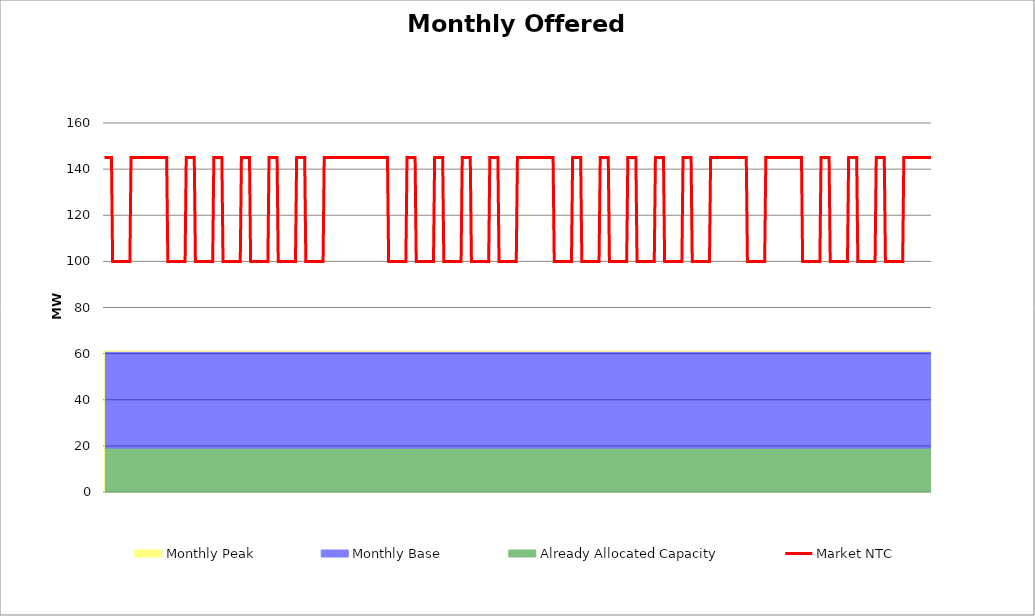
| Category | Market NTC |
|---|---|
| 0 | 145 |
| 1 | 145 |
| 2 | 145 |
| 3 | 145 |
| 4 | 145 |
| 5 | 145 |
| 6 | 145 |
| 7 | 100 |
| 8 | 100 |
| 9 | 100 |
| 10 | 100 |
| 11 | 100 |
| 12 | 100 |
| 13 | 100 |
| 14 | 100 |
| 15 | 100 |
| 16 | 100 |
| 17 | 100 |
| 18 | 100 |
| 19 | 100 |
| 20 | 100 |
| 21 | 100 |
| 22 | 100 |
| 23 | 145 |
| 24 | 145 |
| 25 | 145 |
| 26 | 145 |
| 27 | 145 |
| 28 | 145 |
| 29 | 145 |
| 30 | 145 |
| 31 | 145 |
| 32 | 145 |
| 33 | 145 |
| 34 | 145 |
| 35 | 145 |
| 36 | 145 |
| 37 | 145 |
| 38 | 145 |
| 39 | 145 |
| 40 | 145 |
| 41 | 145 |
| 42 | 145 |
| 43 | 145 |
| 44 | 145 |
| 45 | 145 |
| 46 | 145 |
| 47 | 145 |
| 48 | 145 |
| 49 | 145 |
| 50 | 145 |
| 51 | 145 |
| 52 | 145 |
| 53 | 145 |
| 54 | 145 |
| 55 | 100 |
| 56 | 100 |
| 57 | 100 |
| 58 | 100 |
| 59 | 100 |
| 60 | 100 |
| 61 | 100 |
| 62 | 100 |
| 63 | 100 |
| 64 | 100 |
| 65 | 100 |
| 66 | 100 |
| 67 | 100 |
| 68 | 100 |
| 69 | 100 |
| 70 | 100 |
| 71 | 145 |
| 72 | 145 |
| 73 | 145 |
| 74 | 145 |
| 75 | 145 |
| 76 | 145 |
| 77 | 145 |
| 78 | 145 |
| 79 | 100 |
| 80 | 100 |
| 81 | 100 |
| 82 | 100 |
| 83 | 100 |
| 84 | 100 |
| 85 | 100 |
| 86 | 100 |
| 87 | 100 |
| 88 | 100 |
| 89 | 100 |
| 90 | 100 |
| 91 | 100 |
| 92 | 100 |
| 93 | 100 |
| 94 | 100 |
| 95 | 145 |
| 96 | 145 |
| 97 | 145 |
| 98 | 145 |
| 99 | 145 |
| 100 | 145 |
| 101 | 145 |
| 102 | 145 |
| 103 | 100 |
| 104 | 100 |
| 105 | 100 |
| 106 | 100 |
| 107 | 100 |
| 108 | 100 |
| 109 | 100 |
| 110 | 100 |
| 111 | 100 |
| 112 | 100 |
| 113 | 100 |
| 114 | 100 |
| 115 | 100 |
| 116 | 100 |
| 117 | 100 |
| 118 | 100 |
| 119 | 145 |
| 120 | 145 |
| 121 | 145 |
| 122 | 145 |
| 123 | 145 |
| 124 | 145 |
| 125 | 145 |
| 126 | 145 |
| 127 | 100 |
| 128 | 100 |
| 129 | 100 |
| 130 | 100 |
| 131 | 100 |
| 132 | 100 |
| 133 | 100 |
| 134 | 100 |
| 135 | 100 |
| 136 | 100 |
| 137 | 100 |
| 138 | 100 |
| 139 | 100 |
| 140 | 100 |
| 141 | 100 |
| 142 | 100 |
| 143 | 145 |
| 144 | 145 |
| 145 | 145 |
| 146 | 145 |
| 147 | 145 |
| 148 | 145 |
| 149 | 145 |
| 150 | 145 |
| 151 | 100 |
| 152 | 100 |
| 153 | 100 |
| 154 | 100 |
| 155 | 100 |
| 156 | 100 |
| 157 | 100 |
| 158 | 100 |
| 159 | 100 |
| 160 | 100 |
| 161 | 100 |
| 162 | 100 |
| 163 | 100 |
| 164 | 100 |
| 165 | 100 |
| 166 | 100 |
| 167 | 145 |
| 168 | 145 |
| 169 | 145 |
| 170 | 145 |
| 171 | 145 |
| 172 | 145 |
| 173 | 145 |
| 174 | 145 |
| 175 | 100 |
| 176 | 100 |
| 177 | 100 |
| 178 | 100 |
| 179 | 100 |
| 180 | 100 |
| 181 | 100 |
| 182 | 100 |
| 183 | 100 |
| 184 | 100 |
| 185 | 100 |
| 186 | 100 |
| 187 | 100 |
| 188 | 100 |
| 189 | 100 |
| 190 | 100 |
| 191 | 145 |
| 192 | 145 |
| 193 | 145 |
| 194 | 145 |
| 195 | 145 |
| 196 | 145 |
| 197 | 145 |
| 198 | 145 |
| 199 | 145 |
| 200 | 145 |
| 201 | 145 |
| 202 | 145 |
| 203 | 145 |
| 204 | 145 |
| 205 | 145 |
| 206 | 145 |
| 207 | 145 |
| 208 | 145 |
| 209 | 145 |
| 210 | 145 |
| 211 | 145 |
| 212 | 145 |
| 213 | 145 |
| 214 | 145 |
| 215 | 145 |
| 216 | 145 |
| 217 | 145 |
| 218 | 145 |
| 219 | 145 |
| 220 | 145 |
| 221 | 145 |
| 222 | 145 |
| 223 | 145 |
| 224 | 145 |
| 225 | 145 |
| 226 | 145 |
| 227 | 145 |
| 228 | 145 |
| 229 | 145 |
| 230 | 145 |
| 231 | 145 |
| 232 | 145 |
| 233 | 145 |
| 234 | 145 |
| 235 | 145 |
| 236 | 145 |
| 237 | 145 |
| 238 | 145 |
| 239 | 145 |
| 240 | 145 |
| 241 | 145 |
| 242 | 145 |
| 243 | 145 |
| 244 | 145 |
| 245 | 145 |
| 246 | 145 |
| 247 | 100 |
| 248 | 100 |
| 249 | 100 |
| 250 | 100 |
| 251 | 100 |
| 252 | 100 |
| 253 | 100 |
| 254 | 100 |
| 255 | 100 |
| 256 | 100 |
| 257 | 100 |
| 258 | 100 |
| 259 | 100 |
| 260 | 100 |
| 261 | 100 |
| 262 | 100 |
| 263 | 145 |
| 264 | 145 |
| 265 | 145 |
| 266 | 145 |
| 267 | 145 |
| 268 | 145 |
| 269 | 145 |
| 270 | 145 |
| 271 | 100 |
| 272 | 100 |
| 273 | 100 |
| 274 | 100 |
| 275 | 100 |
| 276 | 100 |
| 277 | 100 |
| 278 | 100 |
| 279 | 100 |
| 280 | 100 |
| 281 | 100 |
| 282 | 100 |
| 283 | 100 |
| 284 | 100 |
| 285 | 100 |
| 286 | 100 |
| 287 | 145 |
| 288 | 145 |
| 289 | 145 |
| 290 | 145 |
| 291 | 145 |
| 292 | 145 |
| 293 | 145 |
| 294 | 145 |
| 295 | 100 |
| 296 | 100 |
| 297 | 100 |
| 298 | 100 |
| 299 | 100 |
| 300 | 100 |
| 301 | 100 |
| 302 | 100 |
| 303 | 100 |
| 304 | 100 |
| 305 | 100 |
| 306 | 100 |
| 307 | 100 |
| 308 | 100 |
| 309 | 100 |
| 310 | 100 |
| 311 | 145 |
| 312 | 145 |
| 313 | 145 |
| 314 | 145 |
| 315 | 145 |
| 316 | 145 |
| 317 | 145 |
| 318 | 145 |
| 319 | 100 |
| 320 | 100 |
| 321 | 100 |
| 322 | 100 |
| 323 | 100 |
| 324 | 100 |
| 325 | 100 |
| 326 | 100 |
| 327 | 100 |
| 328 | 100 |
| 329 | 100 |
| 330 | 100 |
| 331 | 100 |
| 332 | 100 |
| 333 | 100 |
| 334 | 100 |
| 335 | 145 |
| 336 | 145 |
| 337 | 145 |
| 338 | 145 |
| 339 | 145 |
| 340 | 145 |
| 341 | 145 |
| 342 | 145 |
| 343 | 100 |
| 344 | 100 |
| 345 | 100 |
| 346 | 100 |
| 347 | 100 |
| 348 | 100 |
| 349 | 100 |
| 350 | 100 |
| 351 | 100 |
| 352 | 100 |
| 353 | 100 |
| 354 | 100 |
| 355 | 100 |
| 356 | 100 |
| 357 | 100 |
| 358 | 100 |
| 359 | 145 |
| 360 | 145 |
| 361 | 145 |
| 362 | 145 |
| 363 | 145 |
| 364 | 145 |
| 365 | 145 |
| 366 | 145 |
| 367 | 145 |
| 368 | 145 |
| 369 | 145 |
| 370 | 145 |
| 371 | 145 |
| 372 | 145 |
| 373 | 145 |
| 374 | 145 |
| 375 | 145 |
| 376 | 145 |
| 377 | 145 |
| 378 | 145 |
| 379 | 145 |
| 380 | 145 |
| 381 | 145 |
| 382 | 145 |
| 383 | 145 |
| 384 | 145 |
| 385 | 145 |
| 386 | 145 |
| 387 | 145 |
| 388 | 145 |
| 389 | 145 |
| 390 | 145 |
| 391 | 100 |
| 392 | 100 |
| 393 | 100 |
| 394 | 100 |
| 395 | 100 |
| 396 | 100 |
| 397 | 100 |
| 398 | 100 |
| 399 | 100 |
| 400 | 100 |
| 401 | 100 |
| 402 | 100 |
| 403 | 100 |
| 404 | 100 |
| 405 | 100 |
| 406 | 100 |
| 407 | 145 |
| 408 | 145 |
| 409 | 145 |
| 410 | 145 |
| 411 | 145 |
| 412 | 145 |
| 413 | 145 |
| 414 | 145 |
| 415 | 100 |
| 416 | 100 |
| 417 | 100 |
| 418 | 100 |
| 419 | 100 |
| 420 | 100 |
| 421 | 100 |
| 422 | 100 |
| 423 | 100 |
| 424 | 100 |
| 425 | 100 |
| 426 | 100 |
| 427 | 100 |
| 428 | 100 |
| 429 | 100 |
| 430 | 100 |
| 431 | 145 |
| 432 | 145 |
| 433 | 145 |
| 434 | 145 |
| 435 | 145 |
| 436 | 145 |
| 437 | 145 |
| 438 | 145 |
| 439 | 100 |
| 440 | 100 |
| 441 | 100 |
| 442 | 100 |
| 443 | 100 |
| 444 | 100 |
| 445 | 100 |
| 446 | 100 |
| 447 | 100 |
| 448 | 100 |
| 449 | 100 |
| 450 | 100 |
| 451 | 100 |
| 452 | 100 |
| 453 | 100 |
| 454 | 100 |
| 455 | 145 |
| 456 | 145 |
| 457 | 145 |
| 458 | 145 |
| 459 | 145 |
| 460 | 145 |
| 461 | 145 |
| 462 | 145 |
| 463 | 100 |
| 464 | 100 |
| 465 | 100 |
| 466 | 100 |
| 467 | 100 |
| 468 | 100 |
| 469 | 100 |
| 470 | 100 |
| 471 | 100 |
| 472 | 100 |
| 473 | 100 |
| 474 | 100 |
| 475 | 100 |
| 476 | 100 |
| 477 | 100 |
| 478 | 100 |
| 479 | 145 |
| 480 | 145 |
| 481 | 145 |
| 482 | 145 |
| 483 | 145 |
| 484 | 145 |
| 485 | 145 |
| 486 | 145 |
| 487 | 100 |
| 488 | 100 |
| 489 | 100 |
| 490 | 100 |
| 491 | 100 |
| 492 | 100 |
| 493 | 100 |
| 494 | 100 |
| 495 | 100 |
| 496 | 100 |
| 497 | 100 |
| 498 | 100 |
| 499 | 100 |
| 500 | 100 |
| 501 | 100 |
| 502 | 100 |
| 503 | 145 |
| 504 | 145 |
| 505 | 145 |
| 506 | 145 |
| 507 | 145 |
| 508 | 145 |
| 509 | 145 |
| 510 | 145 |
| 511 | 100 |
| 512 | 100 |
| 513 | 100 |
| 514 | 100 |
| 515 | 100 |
| 516 | 100 |
| 517 | 100 |
| 518 | 100 |
| 519 | 100 |
| 520 | 100 |
| 521 | 100 |
| 522 | 100 |
| 523 | 100 |
| 524 | 100 |
| 525 | 100 |
| 526 | 100 |
| 527 | 145 |
| 528 | 145 |
| 529 | 145 |
| 530 | 145 |
| 531 | 145 |
| 532 | 145 |
| 533 | 145 |
| 534 | 145 |
| 535 | 145 |
| 536 | 145 |
| 537 | 145 |
| 538 | 145 |
| 539 | 145 |
| 540 | 145 |
| 541 | 145 |
| 542 | 145 |
| 543 | 145 |
| 544 | 145 |
| 545 | 145 |
| 546 | 145 |
| 547 | 145 |
| 548 | 145 |
| 549 | 145 |
| 550 | 145 |
| 551 | 145 |
| 552 | 145 |
| 553 | 145 |
| 554 | 145 |
| 555 | 145 |
| 556 | 145 |
| 557 | 145 |
| 558 | 145 |
| 559 | 100 |
| 560 | 100 |
| 561 | 100 |
| 562 | 100 |
| 563 | 100 |
| 564 | 100 |
| 565 | 100 |
| 566 | 100 |
| 567 | 100 |
| 568 | 100 |
| 569 | 100 |
| 570 | 100 |
| 571 | 100 |
| 572 | 100 |
| 573 | 100 |
| 574 | 100 |
| 575 | 145 |
| 576 | 145 |
| 577 | 145 |
| 578 | 145 |
| 579 | 145 |
| 580 | 145 |
| 581 | 145 |
| 582 | 145 |
| 583 | 145 |
| 584 | 145 |
| 585 | 145 |
| 586 | 145 |
| 587 | 145 |
| 588 | 145 |
| 589 | 145 |
| 590 | 145 |
| 591 | 145 |
| 592 | 145 |
| 593 | 145 |
| 594 | 145 |
| 595 | 145 |
| 596 | 145 |
| 597 | 145 |
| 598 | 145 |
| 599 | 145 |
| 600 | 145 |
| 601 | 145 |
| 602 | 145 |
| 603 | 145 |
| 604 | 145 |
| 605 | 145 |
| 606 | 145 |
| 607 | 100 |
| 608 | 100 |
| 609 | 100 |
| 610 | 100 |
| 611 | 100 |
| 612 | 100 |
| 613 | 100 |
| 614 | 100 |
| 615 | 100 |
| 616 | 100 |
| 617 | 100 |
| 618 | 100 |
| 619 | 100 |
| 620 | 100 |
| 621 | 100 |
| 622 | 100 |
| 623 | 145 |
| 624 | 145 |
| 625 | 145 |
| 626 | 145 |
| 627 | 145 |
| 628 | 145 |
| 629 | 145 |
| 630 | 145 |
| 631 | 100 |
| 632 | 100 |
| 633 | 100 |
| 634 | 100 |
| 635 | 100 |
| 636 | 100 |
| 637 | 100 |
| 638 | 100 |
| 639 | 100 |
| 640 | 100 |
| 641 | 100 |
| 642 | 100 |
| 643 | 100 |
| 644 | 100 |
| 645 | 100 |
| 646 | 100 |
| 647 | 145 |
| 648 | 145 |
| 649 | 145 |
| 650 | 145 |
| 651 | 145 |
| 652 | 145 |
| 653 | 145 |
| 654 | 145 |
| 655 | 100 |
| 656 | 100 |
| 657 | 100 |
| 658 | 100 |
| 659 | 100 |
| 660 | 100 |
| 661 | 100 |
| 662 | 100 |
| 663 | 100 |
| 664 | 100 |
| 665 | 100 |
| 666 | 100 |
| 667 | 100 |
| 668 | 100 |
| 669 | 100 |
| 670 | 100 |
| 671 | 145 |
| 672 | 145 |
| 673 | 145 |
| 674 | 145 |
| 675 | 145 |
| 676 | 145 |
| 677 | 145 |
| 678 | 145 |
| 679 | 100 |
| 680 | 100 |
| 681 | 100 |
| 682 | 100 |
| 683 | 100 |
| 684 | 100 |
| 685 | 100 |
| 686 | 100 |
| 687 | 100 |
| 688 | 100 |
| 689 | 100 |
| 690 | 100 |
| 691 | 100 |
| 692 | 100 |
| 693 | 100 |
| 694 | 100 |
| 695 | 145 |
| 696 | 145 |
| 697 | 145 |
| 698 | 145 |
| 699 | 145 |
| 700 | 145 |
| 701 | 145 |
| 702 | 145 |
| 703 | 145 |
| 704 | 145 |
| 705 | 145 |
| 706 | 145 |
| 707 | 145 |
| 708 | 145 |
| 709 | 145 |
| 710 | 145 |
| 711 | 145 |
| 712 | 145 |
| 713 | 145 |
| 714 | 145 |
| 715 | 145 |
| 716 | 145 |
| 717 | 145 |
| 718 | 145 |
| 719 | 145 |